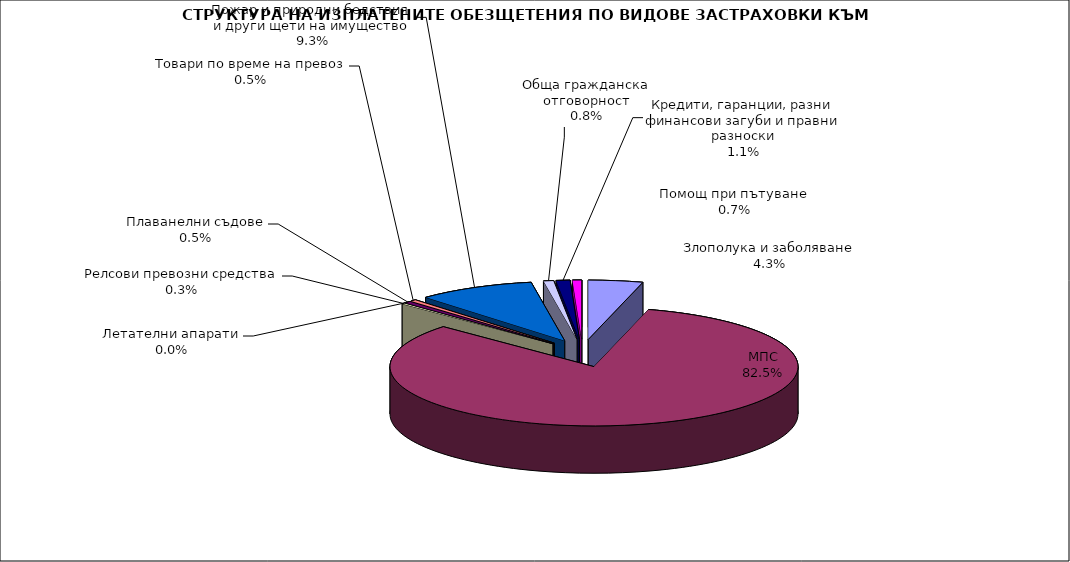
| Category | Series 0 |
|---|---|
| Злополука и заболяване | 0.043 |
| МПС | 0.825 |
| Релсови превозни средства | 0.003 |
| Летателни апарати | 0 |
| Плаванелни съдове | 0.005 |
| Товари по време на превоз | 0.005 |
| Пожар и природни бедствия и други щети на имущество | 0.093 |
| Обща гражданска отговорност | 0.008 |
| Кредити, гаранции, разни финансови загуби и правни разноски | 0.011 |
| Помощ при пътуване | 0.007 |